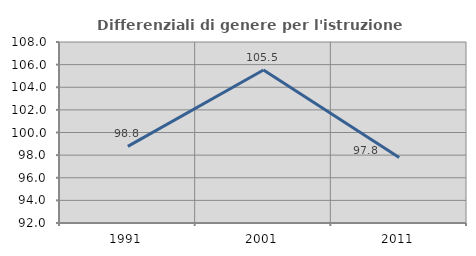
| Category | Differenziali di genere per l'istruzione superiore |
|---|---|
| 1991.0 | 98.769 |
| 2001.0 | 105.521 |
| 2011.0 | 97.799 |